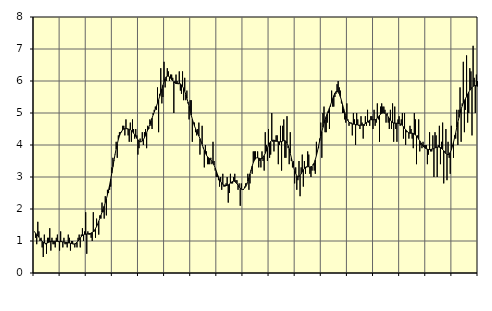
| Category | Piggar | Series 1 |
|---|---|---|
| nan | 1.3 | 1.29 |
| 87.0 | 1.1 | 1.24 |
| 87.0 | 0.9 | 1.2 |
| 87.0 | 1.6 | 1.16 |
| 87.0 | 1.3 | 1.12 |
| 87.0 | 1 | 1.07 |
| 87.0 | 1.1 | 1.03 |
| 87.0 | 0.8 | 0.99 |
| 87.0 | 0.5 | 0.96 |
| 87.0 | 1.2 | 0.94 |
| 87.0 | 0.9 | 0.93 |
| 87.0 | 0.6 | 0.93 |
| nan | 1.1 | 0.94 |
| 88.0 | 1.1 | 0.96 |
| 88.0 | 1.4 | 0.97 |
| 88.0 | 0.7 | 0.99 |
| 88.0 | 1.1 | 0.99 |
| 88.0 | 0.9 | 0.99 |
| 88.0 | 0.9 | 0.99 |
| 88.0 | 0.8 | 0.99 |
| 88.0 | 1.1 | 0.99 |
| 88.0 | 1.2 | 0.99 |
| 88.0 | 1 | 0.98 |
| 88.0 | 0.7 | 0.98 |
| nan | 1.3 | 0.98 |
| 89.0 | 1 | 0.98 |
| 89.0 | 0.8 | 0.97 |
| 89.0 | 1.1 | 0.97 |
| 89.0 | 0.9 | 0.96 |
| 89.0 | 0.9 | 0.96 |
| 89.0 | 0.8 | 0.95 |
| 89.0 | 1.2 | 0.94 |
| 89.0 | 1.1 | 0.94 |
| 89.0 | 0.7 | 0.93 |
| 89.0 | 1 | 0.92 |
| 89.0 | 1 | 0.91 |
| nan | 0.9 | 0.91 |
| 90.0 | 0.8 | 0.91 |
| 90.0 | 0.9 | 0.93 |
| 90.0 | 0.8 | 0.96 |
| 90.0 | 1.1 | 1 |
| 90.0 | 1.2 | 1.04 |
| 90.0 | 0.8 | 1.09 |
| 90.0 | 1.2 | 1.14 |
| 90.0 | 1.4 | 1.17 |
| 90.0 | 1 | 1.19 |
| 90.0 | 1.3 | 1.21 |
| 90.0 | 1.9 | 1.21 |
| nan | 0.6 | 1.22 |
| 91.0 | 1.3 | 1.22 |
| 91.0 | 1.2 | 1.23 |
| 91.0 | 1.2 | 1.23 |
| 91.0 | 1.1 | 1.25 |
| 91.0 | 1 | 1.27 |
| 91.0 | 1.9 | 1.29 |
| 91.0 | 1.3 | 1.33 |
| 91.0 | 1.1 | 1.39 |
| 91.0 | 1.7 | 1.45 |
| 91.0 | 1.5 | 1.53 |
| 91.0 | 1.2 | 1.62 |
| nan | 1.8 | 1.71 |
| 92.0 | 1.7 | 1.8 |
| 92.0 | 2.2 | 1.9 |
| 92.0 | 1.9 | 1.99 |
| 92.0 | 1.7 | 2.09 |
| 92.0 | 2.4 | 2.2 |
| 92.0 | 1.8 | 2.32 |
| 92.0 | 2.6 | 2.44 |
| 92.0 | 2.5 | 2.59 |
| 92.0 | 2.6 | 2.75 |
| 92.0 | 2.7 | 2.93 |
| 92.0 | 3.3 | 3.12 |
| nan | 3.6 | 3.32 |
| 93.0 | 3.5 | 3.52 |
| 93.0 | 3.7 | 3.71 |
| 93.0 | 4.1 | 3.88 |
| 93.0 | 3.6 | 4.03 |
| 93.0 | 4.3 | 4.17 |
| 93.0 | 4.4 | 4.28 |
| 93.0 | 4.4 | 4.37 |
| 93.0 | 4.4 | 4.43 |
| 93.0 | 4.6 | 4.47 |
| 93.0 | 4.6 | 4.5 |
| 93.0 | 4.3 | 4.51 |
| nan | 4.8 | 4.51 |
| 94.0 | 4.5 | 4.51 |
| 94.0 | 4.3 | 4.5 |
| 94.0 | 4.1 | 4.49 |
| 94.0 | 4.7 | 4.48 |
| 94.0 | 4.1 | 4.45 |
| 94.0 | 4.8 | 4.42 |
| 94.0 | 4.5 | 4.37 |
| 94.0 | 4.2 | 4.32 |
| 94.0 | 4.5 | 4.27 |
| 94.0 | 4.3 | 4.21 |
| 94.0 | 3.7 | 4.16 |
| nan | 3.9 | 4.13 |
| 95.0 | 4.2 | 4.1 |
| 95.0 | 4.1 | 4.1 |
| 95.0 | 4.4 | 4.12 |
| 95.0 | 4 | 4.17 |
| 95.0 | 4.4 | 4.23 |
| 95.0 | 4.5 | 4.3 |
| 95.0 | 3.9 | 4.38 |
| 95.0 | 4.6 | 4.47 |
| 95.0 | 4.5 | 4.56 |
| 95.0 | 4.8 | 4.65 |
| 95.0 | 4.6 | 4.75 |
| nan | 4.5 | 4.84 |
| 96.0 | 5 | 4.94 |
| 96.0 | 5.1 | 5.03 |
| 96.0 | 5.2 | 5.12 |
| 96.0 | 5.1 | 5.21 |
| 96.0 | 5.8 | 5.31 |
| 96.0 | 4.4 | 5.41 |
| 96.0 | 5.6 | 5.52 |
| 96.0 | 6.4 | 5.63 |
| 96.0 | 5.3 | 5.75 |
| 96.0 | 5.5 | 5.87 |
| 96.0 | 6.6 | 5.98 |
| nan | 5.8 | 6.07 |
| 97.0 | 6 | 6.13 |
| 97.0 | 6.4 | 6.15 |
| 97.0 | 6.3 | 6.15 |
| 97.0 | 6 | 6.13 |
| 97.0 | 6.2 | 6.09 |
| 97.0 | 6.2 | 6.04 |
| 97.0 | 6.1 | 6 |
| 97.0 | 5 | 5.97 |
| 97.0 | 6 | 5.94 |
| 97.0 | 6.2 | 5.92 |
| 97.0 | 6 | 5.92 |
| nan | 5.9 | 5.92 |
| 98.0 | 6.3 | 5.92 |
| 98.0 | 5.7 | 5.91 |
| 98.0 | 5.6 | 5.88 |
| 98.0 | 6.3 | 5.83 |
| 98.0 | 5.4 | 5.77 |
| 98.0 | 6.1 | 5.68 |
| 98.0 | 5.4 | 5.58 |
| 98.0 | 5.7 | 5.46 |
| 98.0 | 5.3 | 5.34 |
| 98.0 | 4.8 | 5.21 |
| 98.0 | 5.4 | 5.07 |
| nan | 5.4 | 4.93 |
| 99.0 | 4.1 | 4.81 |
| 99.0 | 4.7 | 4.69 |
| 99.0 | 4.7 | 4.59 |
| 99.0 | 4.4 | 4.51 |
| 99.0 | 4.3 | 4.43 |
| 99.0 | 4.5 | 4.35 |
| 99.0 | 4.7 | 4.28 |
| 99.0 | 3.7 | 4.2 |
| 99.0 | 4.1 | 4.11 |
| 99.0 | 4.6 | 4.02 |
| 99.0 | 3.9 | 3.92 |
| nan | 3.3 | 3.83 |
| 0.0 | 4 | 3.75 |
| 0.0 | 3.8 | 3.68 |
| 0.0 | 3.4 | 3.63 |
| 0.0 | 3.4 | 3.6 |
| 0.0 | 3.4 | 3.57 |
| 0.0 | 3.6 | 3.54 |
| 0.0 | 3.4 | 3.49 |
| 0.0 | 4.1 | 3.44 |
| 0.0 | 3.5 | 3.37 |
| 0.0 | 3.2 | 3.28 |
| 0.0 | 3 | 3.19 |
| nan | 3 | 3.09 |
| 1.0 | 2.9 | 3.01 |
| 1.0 | 2.7 | 2.92 |
| 1.0 | 3 | 2.86 |
| 1.0 | 2.6 | 2.81 |
| 1.0 | 3.1 | 2.77 |
| 1.0 | 2.7 | 2.75 |
| 1.0 | 2.7 | 2.74 |
| 1.0 | 2.8 | 2.73 |
| 1.0 | 3 | 2.74 |
| 1.0 | 2.2 | 2.75 |
| 1.0 | 2.5 | 2.78 |
| nan | 3.1 | 2.81 |
| 2.0 | 2.8 | 2.84 |
| 2.0 | 2.8 | 2.86 |
| 2.0 | 3 | 2.87 |
| 2.0 | 3.1 | 2.86 |
| 2.0 | 2.9 | 2.83 |
| 2.0 | 2.9 | 2.79 |
| 2.0 | 2.6 | 2.74 |
| 2.0 | 2.8 | 2.69 |
| 2.0 | 2.1 | 2.65 |
| 2.0 | 2.8 | 2.62 |
| 2.0 | 2.6 | 2.61 |
| nan | 2.6 | 2.62 |
| 3.0 | 2.7 | 2.65 |
| 3.0 | 2.8 | 2.7 |
| 3.0 | 2.8 | 2.77 |
| 3.0 | 3.1 | 2.87 |
| 3.0 | 2.6 | 2.98 |
| 3.0 | 2.8 | 3.1 |
| 3.0 | 3.2 | 3.22 |
| 3.0 | 3.1 | 3.34 |
| 3.0 | 3.8 | 3.45 |
| 3.0 | 3.8 | 3.52 |
| 3.0 | 3.8 | 3.57 |
| nan | 3.6 | 3.6 |
| 4.0 | 3.8 | 3.6 |
| 4.0 | 3.3 | 3.59 |
| 4.0 | 3.5 | 3.58 |
| 4.0 | 3.3 | 3.57 |
| 4.0 | 3.8 | 3.58 |
| 4.0 | 3.5 | 3.61 |
| 4.0 | 3.2 | 3.67 |
| 4.0 | 4.4 | 3.74 |
| 4.0 | 4 | 3.82 |
| 4.0 | 3.5 | 3.91 |
| 4.0 | 4.5 | 3.99 |
| nan | 3.6 | 4.06 |
| 5.0 | 3.7 | 4.11 |
| 5.0 | 5 | 4.14 |
| 5.0 | 4.1 | 4.15 |
| 5.0 | 3.8 | 4.15 |
| 5.0 | 4.1 | 4.14 |
| 5.0 | 4.3 | 4.12 |
| 5.0 | 4.3 | 4.11 |
| 5.0 | 3.4 | 4.1 |
| 5.0 | 4 | 4.1 |
| 5.0 | 4.6 | 4.1 |
| 5.0 | 3.2 | 4.11 |
| nan | 4.6 | 4.12 |
| 6.0 | 4.8 | 4.14 |
| 6.0 | 3.6 | 4.14 |
| 6.0 | 3.6 | 4.11 |
| 6.0 | 4.9 | 4.06 |
| 6.0 | 3.9 | 3.98 |
| 6.0 | 3.4 | 3.88 |
| 6.0 | 4.4 | 3.74 |
| 6.0 | 3.5 | 3.6 |
| 6.0 | 3.3 | 3.45 |
| 6.0 | 3.5 | 3.32 |
| 6.0 | 2.8 | 3.2 |
| nan | 3.3 | 3.11 |
| 7.0 | 2.6 | 3.04 |
| 7.0 | 2.9 | 3.01 |
| 7.0 | 3.5 | 3.01 |
| 7.0 | 2.4 | 3.05 |
| 7.0 | 3.3 | 3.1 |
| 7.0 | 3.7 | 3.16 |
| 7.0 | 2.7 | 3.22 |
| 7.0 | 3.5 | 3.27 |
| 7.0 | 3.1 | 3.31 |
| 7.0 | 3.3 | 3.32 |
| 7.0 | 3.8 | 3.32 |
| nan | 3.7 | 3.32 |
| 8.0 | 3.1 | 3.31 |
| 8.0 | 3 | 3.32 |
| 8.0 | 3.2 | 3.33 |
| 8.0 | 3.4 | 3.37 |
| 8.0 | 3.2 | 3.44 |
| 8.0 | 3.1 | 3.54 |
| 8.0 | 4.1 | 3.67 |
| 8.0 | 3.8 | 3.81 |
| 8.0 | 3.9 | 3.97 |
| 8.0 | 4.2 | 4.13 |
| 8.0 | 4.7 | 4.28 |
| nan | 3.6 | 4.42 |
| 9.0 | 5 | 4.55 |
| 9.0 | 5.2 | 4.68 |
| 9.0 | 4.4 | 4.79 |
| 9.0 | 4.4 | 4.89 |
| 9.0 | 4.7 | 4.98 |
| 9.0 | 5 | 5.07 |
| 9.0 | 4.5 | 5.16 |
| 9.0 | 5.2 | 5.25 |
| 9.0 | 5.7 | 5.35 |
| 9.0 | 5.2 | 5.45 |
| 9.0 | 5.2 | 5.54 |
| nan | 5.5 | 5.62 |
| 10.0 | 5.6 | 5.67 |
| 10.0 | 5.9 | 5.68 |
| 10.0 | 6 | 5.65 |
| 10.0 | 5.8 | 5.6 |
| 10.0 | 5.7 | 5.51 |
| 10.0 | 5.3 | 5.4 |
| 10.0 | 5 | 5.27 |
| 10.0 | 5 | 5.14 |
| 10.0 | 4.8 | 5.02 |
| 10.0 | 4.7 | 4.91 |
| 10.0 | 5.3 | 4.82 |
| nan | 4.8 | 4.76 |
| 11.0 | 4.6 | 4.71 |
| 11.0 | 4.7 | 4.69 |
| 11.0 | 4.7 | 4.67 |
| 11.0 | 4.3 | 4.66 |
| 11.0 | 5 | 4.65 |
| 11.0 | 4.8 | 4.65 |
| 11.0 | 4 | 4.64 |
| 11.0 | 5 | 4.63 |
| 11.0 | 4.8 | 4.63 |
| 11.0 | 4.6 | 4.62 |
| 11.0 | 4.5 | 4.62 |
| nan | 4.9 | 4.62 |
| 12.0 | 4.7 | 4.62 |
| 12.0 | 4.2 | 4.63 |
| 12.0 | 4.6 | 4.65 |
| 12.0 | 4.9 | 4.67 |
| 12.0 | 4.6 | 4.7 |
| 12.0 | 5.1 | 4.72 |
| 12.0 | 4.7 | 4.75 |
| 12.0 | 4.6 | 4.78 |
| 12.0 | 4.9 | 4.79 |
| 12.0 | 4.9 | 4.79 |
| 12.0 | 4.5 | 4.79 |
| nan | 5.1 | 4.79 |
| 13.0 | 4.6 | 4.79 |
| 13.0 | 4.7 | 4.81 |
| 13.0 | 5.3 | 4.84 |
| 13.0 | 4.8 | 4.88 |
| 13.0 | 4.1 | 4.93 |
| 13.0 | 5.2 | 4.96 |
| 13.0 | 5.3 | 4.99 |
| 13.0 | 5.2 | 5 |
| 13.0 | 5.2 | 5 |
| 13.0 | 5.1 | 4.99 |
| 13.0 | 4.7 | 4.96 |
| nan | 5 | 4.92 |
| 14.0 | 4.7 | 4.88 |
| 14.0 | 4.5 | 4.83 |
| 14.0 | 5.1 | 4.78 |
| 14.0 | 4.5 | 4.73 |
| 14.0 | 5.3 | 4.7 |
| 14.0 | 4.1 | 4.69 |
| 14.0 | 5.2 | 4.68 |
| 14.0 | 4.5 | 4.68 |
| 14.0 | 4.1 | 4.68 |
| 14.0 | 4.8 | 4.68 |
| 14.0 | 4.9 | 4.67 |
| nan | 4.6 | 4.66 |
| 15.0 | 4.8 | 4.64 |
| 15.0 | 5 | 4.61 |
| 15.0 | 4.2 | 4.57 |
| 15.0 | 5 | 4.52 |
| 15.0 | 4 | 4.48 |
| 15.0 | 4.4 | 4.44 |
| 15.0 | 4.4 | 4.4 |
| 15.0 | 4.2 | 4.38 |
| 15.0 | 4.6 | 4.37 |
| 15.0 | 4.5 | 4.37 |
| 15.0 | 4.2 | 4.37 |
| nan | 3.9 | 4.36 |
| 16.0 | 5 | 4.34 |
| 16.0 | 4.8 | 4.32 |
| 16.0 | 3.4 | 4.28 |
| 16.0 | 4.3 | 4.24 |
| 16.0 | 4.8 | 4.18 |
| 16.0 | 3.8 | 4.13 |
| 16.0 | 4 | 4.07 |
| 16.0 | 3.9 | 4.02 |
| 16.0 | 4.1 | 3.97 |
| 16.0 | 4 | 3.93 |
| 16.0 | 4 | 3.9 |
| nan | 4 | 3.88 |
| 17.0 | 3.4 | 3.87 |
| 17.0 | 3.7 | 3.86 |
| 17.0 | 4.4 | 3.86 |
| 17.0 | 3.8 | 3.86 |
| 17.0 | 3.8 | 3.87 |
| 17.0 | 4.3 | 3.88 |
| 17.0 | 3 | 3.89 |
| 17.0 | 4.4 | 3.91 |
| 17.0 | 4.3 | 3.92 |
| 17.0 | 3 | 3.93 |
| 17.0 | 4 | 3.94 |
| nan | 4.6 | 3.93 |
| 18.0 | 3.4 | 3.92 |
| 18.0 | 4.1 | 3.89 |
| 18.0 | 4.7 | 3.86 |
| 18.0 | 2.8 | 3.82 |
| 18.0 | 3.8 | 3.77 |
| 18.0 | 4.5 | 3.73 |
| 18.0 | 2.9 | 3.71 |
| 18.0 | 4.1 | 3.7 |
| 18.0 | 3.6 | 3.72 |
| 18.0 | 3.1 | 3.77 |
| 18.0 | 4.6 | 3.85 |
| nan | 4 | 3.96 |
| 19.0 | 3.6 | 4.09 |
| 19.0 | 4.3 | 4.23 |
| 19.0 | 4.2 | 4.38 |
| 19.0 | 5.1 | 4.55 |
| 19.0 | 4 | 4.71 |
| 19.0 | 5.1 | 4.86 |
| 19.0 | 5.8 | 5 |
| 19.0 | 4.1 | 5.12 |
| 19.0 | 5.3 | 5.22 |
| 19.0 | 6.6 | 5.31 |
| 19.0 | 4.4 | 5.39 |
| nan | 5.1 | 5.45 |
| 20.0 | 6.8 | 5.52 |
| 20.0 | 4.7 | 5.59 |
| 20.0 | 5 | 5.65 |
| 20.0 | 6.4 | 5.71 |
| 20.0 | 6.3 | 5.76 |
| 20.0 | 4.3 | 5.8 |
| 20.0 | 7.1 | 5.83 |
| 20.0 | 6.1 | 5.85 |
| 20.0 | 5 | 5.86 |
| 20.0 | 6.2 | 5.85 |
| 20.0 | 6 | 5.83 |